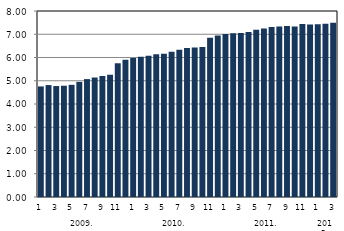
| Category | Девизна штедња |
|---|---|
| 0 | 4.756 |
| 1900-01-01 | 4.814 |
| 1900-01-02 | 4.772 |
| 1900-01-03 | 4.786 |
| 1900-01-04 | 4.825 |
| 1900-01-05 | 4.951 |
| 1900-01-06 | 5.071 |
| 1900-01-07 | 5.139 |
| 1900-01-08 | 5.204 |
| 1900-01-09 | 5.259 |
| 1900-01-10 | 5.757 |
| 1900-01-11 | 5.907 |
| 1900-01-12 | 5.979 |
| 1900-01-13 | 6.031 |
| 1900-01-14 | 6.075 |
| 1900-01-15 | 6.137 |
| 1900-01-16 | 6.165 |
| 1900-01-17 | 6.252 |
| 1900-01-18 | 6.336 |
| 1900-01-19 | 6.41 |
| 1900-01-20 | 6.435 |
| 1900-01-21 | 6.454 |
| 1900-01-22 | 6.845 |
| 1900-01-23 | 6.941 |
| 1900-01-24 | 7.005 |
| 1900-01-25 | 7.047 |
| 1900-01-26 | 7.057 |
| 1900-01-27 | 7.102 |
| 1900-01-28 | 7.191 |
| 1900-01-29 | 7.25 |
| 1900-01-30 | 7.307 |
| 1900-01-31 | 7.334 |
| 1900-02-01 | 7.357 |
| 1900-02-02 | 7.337 |
| 1900-02-03 | 7.438 |
| 1900-02-04 | 7.415 |
| 1900-02-05 | 7.433 |
| 1900-02-06 | 7.452 |
| 1900-02-07 | 7.494 |